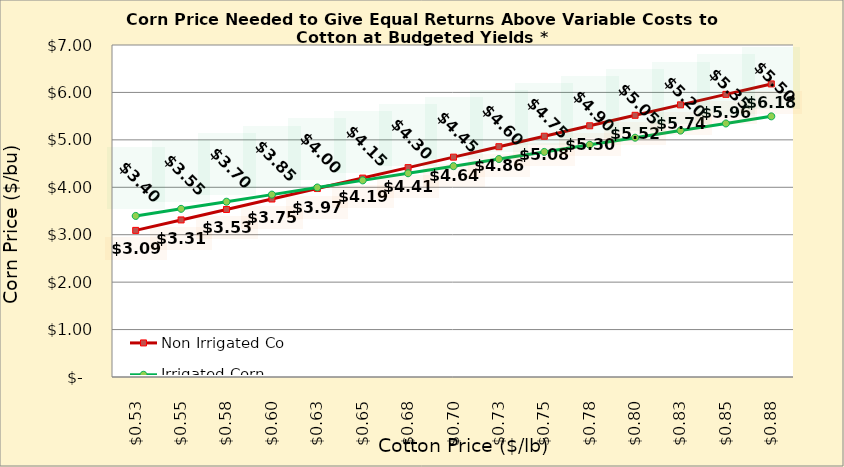
| Category | Non Irrigated Corn | Irrigated Corn |
|---|---|---|
| 0.5249999999999998 | 3.091 | 3.396 |
| 0.5499999999999998 | 3.312 | 3.546 |
| 0.5749999999999998 | 3.532 | 3.696 |
| 0.5999999999999999 | 3.753 | 3.846 |
| 0.6249999999999999 | 3.974 | 3.996 |
| 0.6499999999999999 | 4.194 | 4.146 |
| 0.6749999999999999 | 4.415 | 4.296 |
| 0.7 | 4.635 | 4.446 |
| 0.725 | 4.856 | 4.596 |
| 0.75 | 5.076 | 4.746 |
| 0.775 | 5.297 | 4.896 |
| 0.8 | 5.518 | 5.046 |
| 0.8250000000000001 | 5.738 | 5.196 |
| 0.8500000000000001 | 5.959 | 5.346 |
| 0.8750000000000001 | 6.179 | 5.496 |